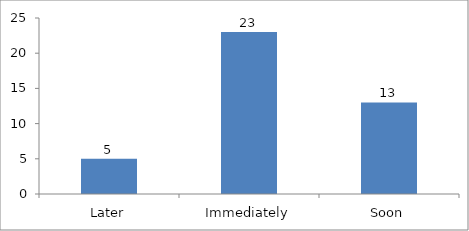
| Category | When would you like to begin your changemaking journey?  |
|---|---|
| Later | 5 |
| Immediately | 23 |
| Soon | 13 |